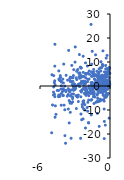
| Category | Series 0 |
|---|---|
| -1.5 | 4.1 |
| -0.8 | -2.2 |
| -1.933066 | 8.317 |
| -0.1999996 | -0.9 |
| -1.2 | 0.4 |
| -2.102489 | -3.002 |
| -4.400001 | -4.4 |
| -3.450099 | -2.459 |
| -0.9617063 | 5.282 |
| -4.403912 | -1.87 |
| -1.300085 | -4.6 |
| -3.400092 | 3.7 |
| -1.956653 | -8.964 |
| -2.845195 | 2.681 |
| -3.385443 | -4.174 |
| -0.4735954 | 5.872 |
| -1.113081 | 1.539 |
| -0.3622035 | 4.215 |
| -0.3629686 | 5.092 |
| -0.0994698 | 1.808 |
| -3.799078 | -1.87 |
| -1.135605 | -0.46 |
| -2.899998 | 3.4 |
| -4.181784 | -8.007 |
| -1.264757 | -0.382 |
| -2.323901 | -6.499 |
| -0.3673095 | 7.098 |
| -0.929783 | -0.446 |
| -1.222435 | 4.729 |
| -1.899995 | -6.8 |
| -3.299995 | -7.2 |
| -2.367339 | -1.576 |
| -4.032258 | -3.777 |
| -0.0360685 | 0.171 |
| -1.327627 | 4.326 |
| -0.2792837 | 0.316 |
| -0.9618731 | 2.265 |
| -2.618646 | -0.117 |
| -0.6349207 | 8.63 |
| -0.5813953 | 3.512 |
| -1.418726 | 5.856 |
| -1.99999 | -1.6 |
| -2.074413 | 1.353 |
| -2.849036 | 6.127 |
| -3.938738 | -7.981 |
| -0.2083533 | 3.818 |
| -0.7857022 | 6.244 |
| -4.399844 | -3.804 |
| -3.400023 | 1.907 |
| -4.168469 | -3.137 |
| -0.4669132 | 4.198 |
| -0.2359781 | 7.336 |
| -0.5 | -9.6 |
| -1.006466 | -1.653 |
| -1.2 | 0.4 |
| -0.2363366 | 5.559 |
| -0.6029275 | 8.467 |
| -0.8324614 | 0.178 |
| -1.054017 | 2.661 |
| -4.976821 | 4.688 |
| -1.254671 | 0.216 |
| -2.152696 | -10.017 |
| -3.020298 | -0.454 |
| -2.120219 | -1.266 |
| -2.711472 | 0.663 |
| -2.995342 | 9.959 |
| -3.571762 | -9.599 |
| -2.120112 | -1.425 |
| -1.665471 | -1.596 |
| -1.669853 | -1.274 |
| -0.4942533 | -21.923 |
| -2.074035 | 3.42 |
| -0.7749695 | 1.34 |
| -0.6828502 | -1.563 |
| -1.213167 | -6.778 |
| -0.7090947 | 3.76 |
| -1.033022 | 4.707 |
| -2.678449 | 5.322 |
| -4.204015 | -1.279 |
| -3.180677 | 1.914 |
| -1.340394 | 2.875 |
| -0.2394602 | 3.99 |
| -3.280843 | -3.411 |
| -0.9796832 | -6.473 |
| -0.6248121 | 3.113 |
| -2.582199 | 4.994 |
| -1.582223 | 3.99 |
| -0.9345794 | 7.084 |
| -2.248876 | -9.611 |
| -0.952381 | 3.855 |
| -2.5 | -4.5 |
| -0.5 | 0.64 |
| -1.09 | -1.05 |
| -0.25 | 12.736 |
| -2.0684 | -1.947 |
| -1.667642 | -3.027 |
| -4.38726 | 6.287 |
| -1.004699 | 0.947 |
| -1.030183 | -3.038 |
| -0.860283 | 3.318 |
| -2.042614 | -0.652 |
| -2.384591 | -7.741 |
| -2.429304 | -14.041 |
| -0.6742712 | -0.99 |
| -4.841785 | -2.547 |
| -0.9003067 | -1.428 |
| -0.923761 | -1.585 |
| -0.4425466 | -1.1 |
| -0.0158353 | 0.634 |
| -0.7134491 | -5.802 |
| -0.6540618 | -1.141 |
| -3.544668 | 14.83 |
| -0.2006224 | -1.389 |
| -2.599284 | 3.236 |
| -4.277593 | -4.267 |
| -2.122535 | 1.399 |
| -0.2516747 | 1.052 |
| -0.3937008 | 2.373 |
| -0.3584229 | 5.757 |
| -4.846939 | -3.775 |
| -1.90815 | -10.534 |
| -3.133046 | -1.768 |
| -2.420382 | 2.018 |
| -1.338199 | -3.064 |
| -4.72973 | 8.273 |
| -4.924242 | -7.912 |
| -1.128881 | 6.113 |
| -2.304894 | -13.718 |
| -0.4572629 | 2.144 |
| -4.185226 | 2.108 |
| -2.098517 | 9.631 |
| -1.370977 | -7.287 |
| -1.426189 | -2.547 |
| -0.2784651 | 3.965 |
| -0.6126528 | 1.733 |
| -2.941341 | -0.976 |
| -2.1 | -17.5 |
| -3.086776 | 0.86 |
| -0.786428 | -2.695 |
| -2.279145 | 3.991 |
| -1.392758 | 4.963 |
| -0.7712082 | 10.11 |
| -0.7900677 | 3.305 |
| -3.184713 | 3.394 |
| -1.149425 | 0.013 |
| -4.166667 | 1.63 |
| -0.4347826 | -0.435 |
| -0.7881356 | 0.766 |
| -0.9791992 | 1.548 |
| -0.7333342 | -0.03 |
| -2.916379 | -0.064 |
| -2.511031 | -2.058 |
| -3.635031 | 2.439 |
| -1.553721 | -2.686 |
| -2.258863 | 2.029 |
| -1.6 | 0.4 |
| -0.4443037 | -4.839 |
| -3.502825 | -6.079 |
| -0.5980861 | -0.478 |
| -3.35307 | 3.443 |
| -1.207861 | 1.394 |
| -0.2801923 | 1.656 |
| -1.52389 | 14.456 |
| -0.4975118 | 3.702 |
| -3.4 | 2.1 |
| -0.9999986 | 4.6 |
| -0.199338 | 1.99 |
| -0.9854139 | -0.417 |
| -1.798001 | -0.978 |
| -2.797277 | -4.297 |
| -0.4323401 | 0.127 |
| -1.130717 | -1.57 |
| -2.251243 | -7.173 |
| -1.044374 | -1.296 |
| -3.522888 | -1.718 |
| -0.1347709 | -3.137 |
| -1.391221 | -2.316 |
| -1.303258 | 2.777 |
| -1.889535 | 5.402 |
| -2.432 | 1.299 |
| -2.459114 | 4.308 |
| -0.2530675 | 1.282 |
| -0.0652631 | 0.671 |
| -3.49666 | -15.389 |
| -1.477944 | 0.047 |
| -2.151167 | 1.978 |
| -0.0897692 | 0.169 |
| -0.2238066 | -3.598 |
| -4.681171 | -8.27 |
| -0.716092 | 2.875 |
| -2.611039 | 0.973 |
| -2.208835 | 1.282 |
| -3.33672 | -21.782 |
| -1.471012 | -3.169 |
| -0.729443 | 2.475 |
| -2.162374 | -7.801 |
| -0.0682748 | 1.109 |
| -2.651701 | 3.927 |
| -0.88813 | 1.264 |
| -1.049845 | -6.531 |
| -2.770388 | -4.469 |
| -1.225203 | 1.866 |
| -2.003148 | -2.202 |
| -1.041636 | -6.569 |
| -0.4542629 | 1.288 |
| -0.1010693 | -0.101 |
| -1.827676 | -15.392 |
| -4.718693 | 17.377 |
| -0.5847953 | 0.003 |
| -2.092141 | 5.088 |
| -2.882325 | -9.407 |
| -4.257685 | 4.308 |
| -1.788597 | 2.902 |
| -2.599993 | -0.21 |
| -0.8 | 0.3 |
| -3.808821 | -23.849 |
| -4.709414 | -13.015 |
| -2.712274 | -6.475 |
| -0.6070792 | -0.984 |
| -1.763929 | -2.723 |
| -0.790063 | 4.233 |
| -1.528264 | 4.268 |
| -0.8426212 | -6.221 |
| -0.7185569 | 3.712 |
| -3.209308 | -5.228 |
| -3.986668 | -1.605 |
| -2.469971 | 7.453 |
| -0.0421013 | 1.636 |
| -4.72626 | -4.463 |
| -0.2147997 | 1.41 |
| -4.075689 | -2.315 |
| -1.265823 | 0.016 |
| -1.5625 | 5.898 |
| -1.388889 | 0.02 |
| -4.048789 | 2.847 |
| -1.753702 | 4.838 |
| -4.769891 | 1.371 |
| -4.629436 | -11.814 |
| -1.818226 | -2.744 |
| -3.202516 | -6.577 |
| -0.3238631 | 11.614 |
| -3.23497 | 0.598 |
| -3.275221 | 8.58 |
| -0.9911495 | -0.236 |
| -2.477377 | 1.071 |
| -1.626016 | 25.647 |
| -0.8438818 | -5.525 |
| -1.930502 | -2.324 |
| -2.120141 | 1.49 |
| -3.135889 | -0.258 |
| -1.823708 | 0.034 |
| -3.107345 | 6.805 |
| -4.010025 | -1.138 |
| -0.4716981 | 1.661 |
| -1.070336 | 3.721 |
| -0.5208128 | -4.007 |
| -3.078955 | -1.357 |
| -0.6054924 | -0.474 |
| -4.700336 | 0.41 |
| -2.485634 | -11.684 |
| -2.069481 | 5.244 |
| -2.764603 | 6.854 |
| -0.5571682 | 3.78 |
| -2.544145 | 7.87 |
| -2.097739 | -2.838 |
| -1.560702 | 5.678 |
| -0.1799422 | 0.894 |
| -2.3 | 12.4 |
| -0.9568424 | 1.643 |
| -1.057421 | -5.063 |
| -0.6493635 | 9.011 |
| -1.619904 | 1.385 |
| -0.1010887 | 5.002 |
| -0.5138766 | -1.797 |
| -3.772684 | -2.372 |
| -1.056668 | -1.551 |
| -0.5715078 | -2.725 |
| -3.303044 | -1.624 |
| -0.1241202 | 6.734 |
| -2.129426 | -1.255 |
| -0.8312261 | -0.373 |
| -0.1552313 | 5.057 |
| -0.8168246 | 3.798 |
| -1.565665 | -5.649 |
| -0.4 | 4.6 |
| -2.75921 | 0.432 |
| -3.401563 | -10.967 |
| -0.1776801 | 1.997 |
| -3.863643 | -20.683 |
| -1.308459 | 1.181 |
| -2.583632 | 5.457 |
| -0.8253764 | 7.59 |
| -0.7118124 | 7.648 |
| -1.053188 | -6.104 |
| -4.825068 | -0.4 |
| -0.2553328 | 0.783 |
| -1.622536 | -1.021 |
| -2.3612 | -8.766 |
| -3.992226 | 1.253 |
| -1.100585 | -3.767 |
| -4.524362 | -1.851 |
| -1.849837 | -15.264 |
| -1.620029 | -5.911 |
| -2.317721 | -1.169 |
| -0.9834996 | 2.594 |
| -1.42369 | -4.419 |
| -3.446136 | 3.152 |
| -2.454582 | -2.5 |
| -1.397618 | -4.44 |
| -1.36608 | -3.68 |
| -3.965691 | 9.127 |
| -1.238968 | 12.986 |
| -0.6451613 | 4.55 |
| -0.4672897 | 0.941 |
| -0.5783179 | -0.241 |
| -0.5767139 | 2.505 |
| -0.3660276 | 3.496 |
| -4.348354 | 2.543 |
| -1.041881 | 0.595 |
| -0.6873243 | 0.802 |
| -0.9342411 | 0.877 |
| -2.978074 | -1.079 |
| -1.826857 | -5.855 |
| -0.1 | 2.3 |
| -0.5 | -6.3 |
| -5.0 | -19.5 |
| -3.575847 | -1.103 |
| -2.468354 | 3.567 |
| -0.2951304 | 0.001 |
| -4.3 | 2.3 |
| -1.081359 | -11.395 |
| -3.873971 | -9.904 |
| -2.152646 | -0.952 |
| -3.760054 | 4.464 |
| -0.7484856 | 4.116 |
| -0.1211395 | 6.311 |
| -3.316771 | 1.753 |
| -0.592431 | 3.385 |
| -0.6756381 | 1.88 |
| -0.0173286 | 5.346 |
| -2.2567 | -6.133 |
| -2.436569 | -1.952 |
| -2.271163 | -1.058 |
| -2.140515 | -3.248 |
| -1.062273 | 2.004 |
| -3.03765 | -1.593 |
| -0.5606294 | 1.318 |
| -1.575768 | 0.124 |
| -0.9250147 | -16.812 |
| -3.419882 | -6.651 |
| -0.687041 | 0.641 |
| -2.22523 | 3.87 |
| -0.9522901 | 3.259 |
| -0.6033883 | 14.637 |
| -0.3998824 | -16.3 |
| -0.2017981 | 1.012 |
| -1.004603 | 0.947 |
| -1.030098 | -3.038 |
| -2.718169 | -3.776 |
| -2.788845 | -4.586 |
| -3.132323 | -3.334 |
| -0.9140768 | 0.377 |
| -0.4857317 | -14.763 |
| -4.738347 | 2.151 |
| -0.3833908 | -2.23 |
| -1.211484 | -1.194 |
| -0.3177857 | -1.336 |
| -1.538101 | 1.502 |
| -0.4078582 | 0.831 |
| -1.313657 | 1.021 |
| -3.575491 | -3.558 |
| -0.6199239 | -2.71 |
| -0.0606522 | 7.773 |
| -3.134953 | 4.342 |
| -1.544978 | -1.25 |
| -2.870813 | -4.102 |
| -3.504673 | -2.052 |
| -0.3708282 | 8.562 |
| -1.818182 | -4.04 |
| -0.2659574 | -4.088 |
| -1.547031 | 0.484 |
| -1.026845 | -2.002 |
| -0.557043 | -5.742 |
| -0.2863409 | 0.996 |
| -1.476154 | -0.779 |
| -0.9349999 | -1.068 |
| -2.122083 | 0.767 |
| -2.978681 | 16.272 |
| -1.400123 | 6.9 |
| -4.756893 | -3.506 |
| -1.09019 | 4.463 |
| -3.121053 | -0.826 |
| -2.036762 | 4.866 |
| -1.259919 | 4.315 |
| -1.566612 | 9.064 |
| -1.602564 | -12.026 |
| -2.293578 | 5.688 |
| -4.169316 | 0.084 |
| -0.6211848 | -1.09 |
| -3.419027 | -7.127 |
| -2.483971 | 7.616 |
| -0.5903188 | -3.797 |
| -3.870968 | -0.068 |
| -2.262931 | 0.273 |
| -0.9677419 | -2.271 |
| -4.243775 | 3.568 |
| -1.647221 | -3.101 |
| -4.390593 | -4.483 |
| -0.4818356 | 4.192 |
| -1.453302 | 5.248 |
| -1.918843 | 1.826 |
| -0.8683038 | -1.647 |
| -3.365346 | 3.409 |
| -4.825875 | 4.331 |
| -0.3460208 | -3.703 |
| -4.381916 | 2.891 |
| -1.779661 | 6.244 |
| -2.52174 | -21.79 |
| -2.623295 | 13.109 |
| -0.0285677 | 7.334 |
| -1.69855 | -2.395 |
| -2.195771 | -3.043 |
| -1.236319 | -0.789 |
| -0.3320443 | -4.643 |
| -0.5911348 | -0.947 |
| -0.2285162 | 2.366 |
| -1.911148 | 2.722 |
| -0.0737016 | 3.481 |
| -0.2916211 | -3.067 |
| -1.492537 | -1.493 |
| -3.791469 | -1.821 |
| -0.4444444 | -1.784 |
| -1.347709 | 4.117 |
| -2.054795 | -3.92 |
| -1.902843 | -3.191 |
| -2.349332 | 1.602 |
| -0.1979286 | 6.173 |
| -3.202303 | -4.691 |
| -4.0 | -4 |
| -0.1886902 | -0.189 |
| -0.9620253 | 5.781 |
| -2.429235 | 1.882 |
| -4.338823 | -3.765 |
| -3.043346 | 0.811 |
| -2.911638 | -4.056 |
| -3.658145 | -4.237 |
| -0.0773395 | -13.386 |
| -0.3857463 | 4.264 |